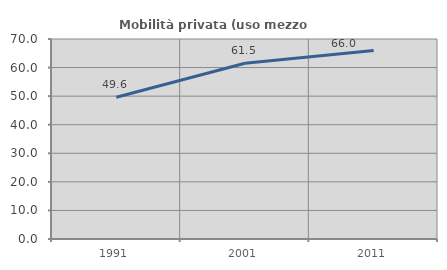
| Category | Mobilità privata (uso mezzo privato) |
|---|---|
| 1991.0 | 49.59 |
| 2001.0 | 61.498 |
| 2011.0 | 65.952 |